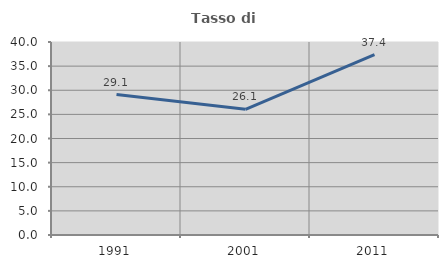
| Category | Tasso di occupazione   |
|---|---|
| 1991.0 | 29.109 |
| 2001.0 | 26.052 |
| 2011.0 | 37.375 |